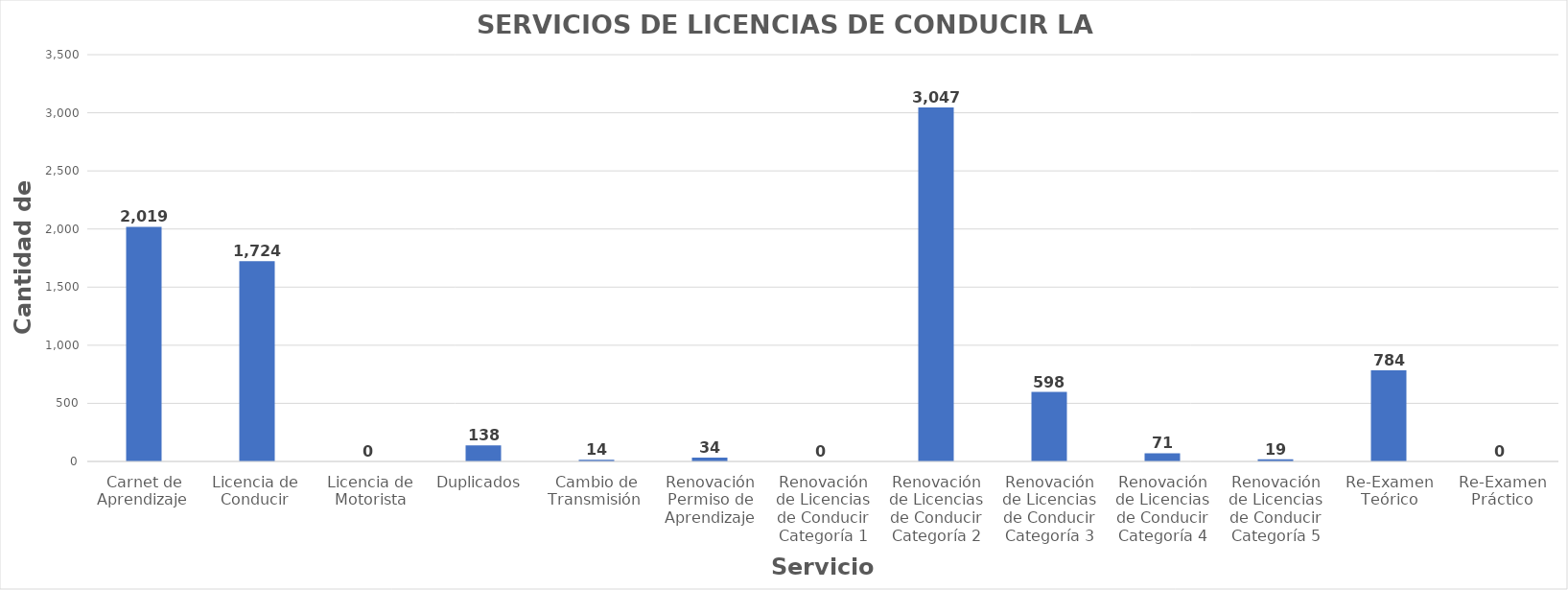
| Category | Series 0 |
|---|---|
| Carnet de Aprendizaje  | 2019 |
| Licencia de  Conducir  | 1724 |
| Licencia de Motorista | 0 |
| Duplicados  | 138 |
| Cambio de Transmisión  | 14 |
| Renovación Permiso de Aprendizaje | 34 |
| Renovación de Licencias de Conducir Categoría 1 | 0 |
| Renovación de Licencias de Conducir Categoría 2 | 3047 |
| Renovación de Licencias de Conducir Categoría 3 | 598 |
| Renovación de Licencias de Conducir Categoría 4 | 71 |
| Renovación de Licencias de Conducir Categoría 5 | 19 |
| Re-Examen Teórico | 784 |
| Re-Examen Práctico | 0 |